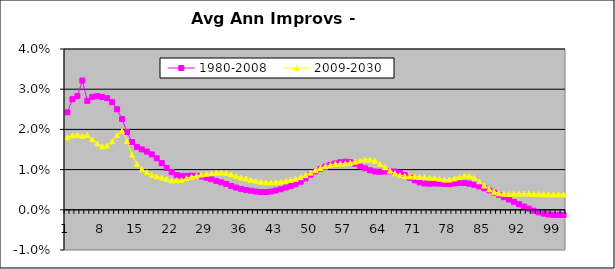
| Category | 1980-2008 | 2009-2030 |
|---|---|---|
| 0 | 0.024 | 0.018 |
| 1 | 0.028 | 0.019 |
| 2 | 0.028 | 0.019 |
| 3 | 0.032 | 0.018 |
| 4 | 0.027 | 0.019 |
| 5 | 0.028 | 0.018 |
| 6 | 0.028 | 0.017 |
| 7 | 0.028 | 0.016 |
| 8 | 0.028 | 0.016 |
| 9 | 0.027 | 0.017 |
| 10 | 0.025 | 0.019 |
| 11 | 0.023 | 0.02 |
| 12 | 0.019 | 0.017 |
| 13 | 0.017 | 0.014 |
| 14 | 0.016 | 0.011 |
| 15 | 0.015 | 0.01 |
| 16 | 0.014 | 0.009 |
| 17 | 0.014 | 0.009 |
| 18 | 0.013 | 0.008 |
| 19 | 0.012 | 0.008 |
| 20 | 0.01 | 0.008 |
| 21 | 0.009 | 0.007 |
| 22 | 0.009 | 0.007 |
| 23 | 0.008 | 0.007 |
| 24 | 0.008 | 0.008 |
| 25 | 0.008 | 0.008 |
| 26 | 0.008 | 0.008 |
| 27 | 0.008 | 0.009 |
| 28 | 0.008 | 0.009 |
| 29 | 0.008 | 0.009 |
| 30 | 0.007 | 0.009 |
| 31 | 0.007 | 0.009 |
| 32 | 0.006 | 0.009 |
| 33 | 0.006 | 0.009 |
| 34 | 0.006 | 0.008 |
| 35 | 0.005 | 0.008 |
| 36 | 0.005 | 0.008 |
| 37 | 0.005 | 0.007 |
| 38 | 0.005 | 0.007 |
| 39 | 0.004 | 0.007 |
| 40 | 0.004 | 0.007 |
| 41 | 0.005 | 0.007 |
| 42 | 0.005 | 0.007 |
| 43 | 0.005 | 0.007 |
| 44 | 0.006 | 0.007 |
| 45 | 0.006 | 0.007 |
| 46 | 0.006 | 0.008 |
| 47 | 0.007 | 0.008 |
| 48 | 0.008 | 0.009 |
| 49 | 0.009 | 0.009 |
| 50 | 0.01 | 0.01 |
| 51 | 0.01 | 0.01 |
| 52 | 0.011 | 0.011 |
| 53 | 0.011 | 0.011 |
| 54 | 0.012 | 0.011 |
| 55 | 0.012 | 0.011 |
| 56 | 0.012 | 0.012 |
| 57 | 0.012 | 0.012 |
| 58 | 0.011 | 0.012 |
| 59 | 0.011 | 0.012 |
| 60 | 0.01 | 0.012 |
| 61 | 0.01 | 0.013 |
| 62 | 0.01 | 0.012 |
| 63 | 0.009 | 0.011 |
| 64 | 0.01 | 0.011 |
| 65 | 0.01 | 0.01 |
| 66 | 0.01 | 0.009 |
| 67 | 0.009 | 0.009 |
| 68 | 0.009 | 0.008 |
| 69 | 0.008 | 0.008 |
| 70 | 0.007 | 0.008 |
| 71 | 0.007 | 0.008 |
| 72 | 0.007 | 0.008 |
| 73 | 0.006 | 0.008 |
| 74 | 0.007 | 0.008 |
| 75 | 0.007 | 0.008 |
| 76 | 0.006 | 0.008 |
| 77 | 0.006 | 0.008 |
| 78 | 0.007 | 0.008 |
| 79 | 0.007 | 0.008 |
| 80 | 0.007 | 0.008 |
| 81 | 0.006 | 0.008 |
| 82 | 0.006 | 0.008 |
| 83 | 0.006 | 0.007 |
| 84 | 0.005 | 0.006 |
| 85 | 0.005 | 0.005 |
| 86 | 0.004 | 0.004 |
| 87 | 0.004 | 0.004 |
| 88 | 0.003 | 0.004 |
| 89 | 0.003 | 0.004 |
| 90 | 0.002 | 0.004 |
| 91 | 0.001 | 0.004 |
| 92 | 0.001 | 0.004 |
| 93 | 0 | 0.004 |
| 94 | 0 | 0.004 |
| 95 | -0.001 | 0.004 |
| 96 | -0.001 | 0.004 |
| 97 | -0.001 | 0.004 |
| 98 | -0.001 | 0.004 |
| 99 | -0.001 | 0.004 |
| 100 | -0.001 | 0.004 |